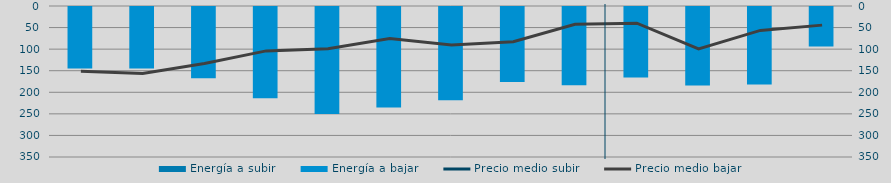
| Category | Energía a subir | Energía a bajar |
|---|---|---|
| A |  | 145.139 |
| M |  | 144.75 |
| J |  | 167.183 |
| J |  | 214.052 |
| A |  | 250.14 |
| S |  | 234.984 |
| O |  | 218.689 |
| N |  | 176.116 |
| D |  | 183.605 |
| E |  | 165.84 |
| F |  | 184.155 |
| M |  | 182.05 |
| A |  | 93.896 |